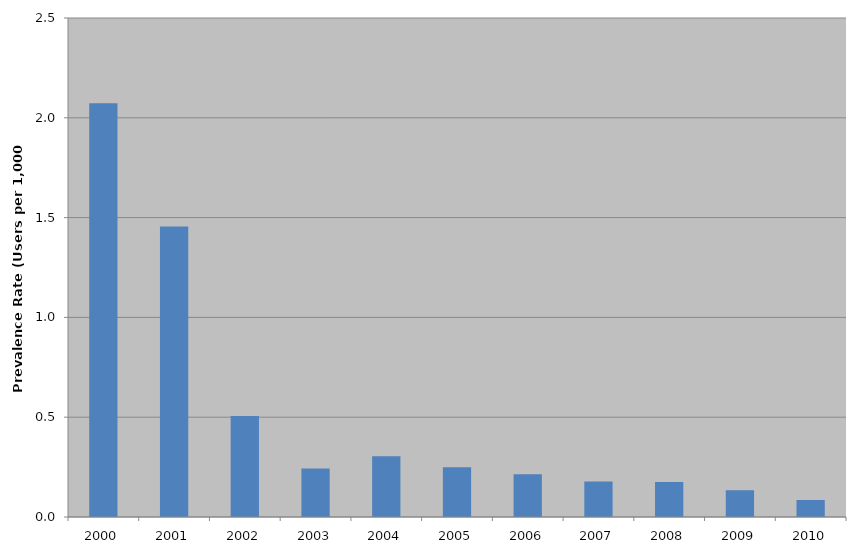
| Category | Total |
|---|---|
| 2000 | 2.073 |
| 2001 | 1.455 |
| 2002 | 0.506 |
| 2003 | 0.243 |
| 2004 | 0.305 |
| 2005 | 0.249 |
| 2006 | 0.214 |
| 2007 | 0.178 |
| 2008 | 0.175 |
| 2009 | 0.134 |
| 2010 | 0.085 |